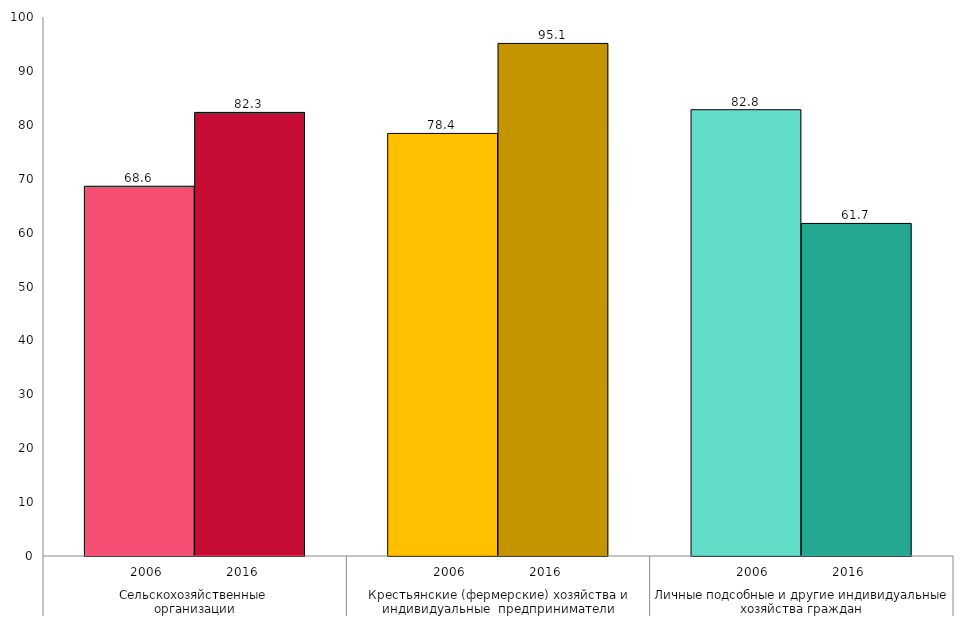
| Category | Series 0 | Series 1 |
|---|---|---|
| 0 | 68.6 | 82.3 |
| 1 | 78.4 | 95.1 |
| 2 | 82.8 | 61.7 |